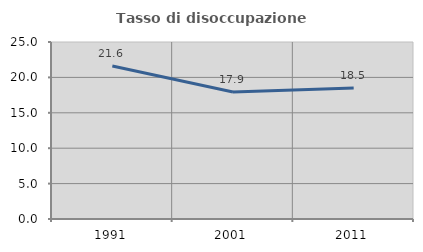
| Category | Tasso di disoccupazione giovanile  |
|---|---|
| 1991.0 | 21.622 |
| 2001.0 | 17.949 |
| 2011.0 | 18.519 |